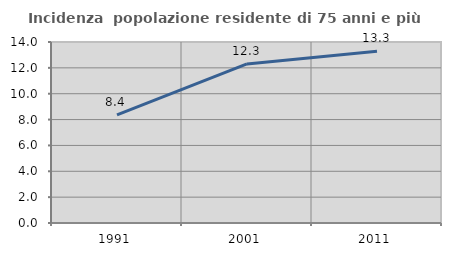
| Category | Incidenza  popolazione residente di 75 anni e più |
|---|---|
| 1991.0 | 8.364 |
| 2001.0 | 12.303 |
| 2011.0 | 13.288 |